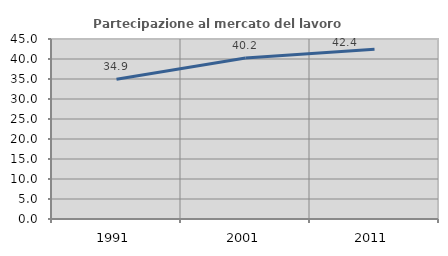
| Category | Partecipazione al mercato del lavoro  femminile |
|---|---|
| 1991.0 | 34.922 |
| 2001.0 | 40.234 |
| 2011.0 | 42.409 |